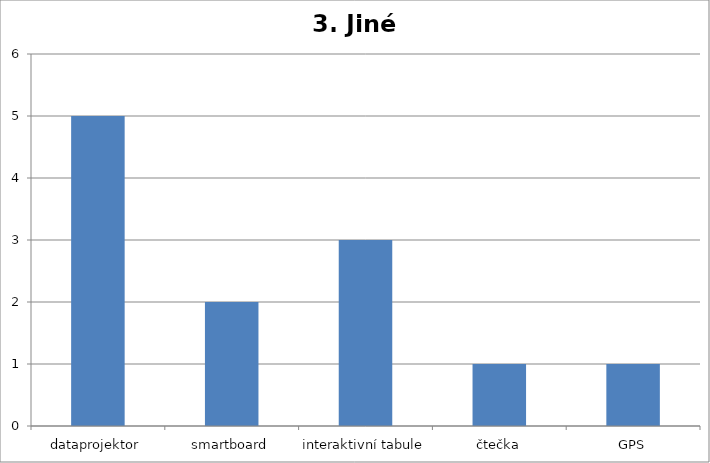
| Category | Series 0 |
|---|---|
| dataprojektor | 5 |
| smartboard | 2 |
| interaktivní tabule | 3 |
| čtečka | 1 |
| GPS | 1 |